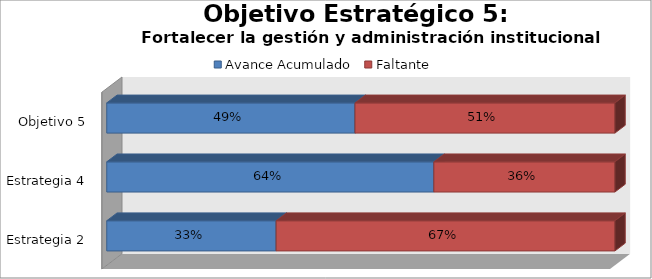
| Category | Avance Acumulado | Faltante |
|---|---|---|
| Estrategia 2 | 0.333 | 0.667 |
| Estrategia 4 | 0.644 | 0.356 |
| Objetivo 5 | 0.489 | 0.511 |